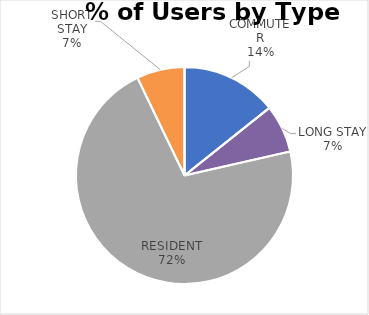
| Category | STAFFORD PLACE |
|---|---|
| COMMUTER | 2 |
| ILLEGAL | 0 |
| LONG STAY | 1 |
| RESIDENT | 10 |
| SHORT STAY | 1 |
| DISABLED | 0 |
| OTHER | 0 |